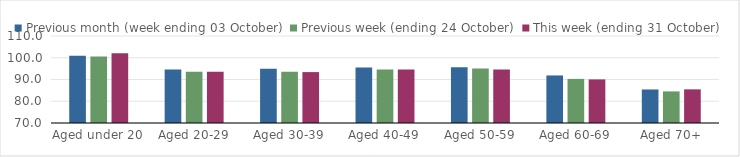
| Category | Previous month (week ending 03 October) | Previous week (ending 24 October) | This week (ending 31 October) |
|---|---|---|---|
| Aged under 20 | 100.92 | 100.57 | 102.1 |
| Aged 20-29 | 94.56 | 93.51 | 93.61 |
| Aged 30-39 | 94.95 | 93.53 | 93.41 |
| Aged 40-49 | 95.49 | 94.56 | 94.6 |
| Aged 50-59 | 95.6 | 95.04 | 94.63 |
| Aged 60-69 | 91.86 | 90.28 | 90.04 |
| Aged 70+ | 85.42 | 84.53 | 85.47 |